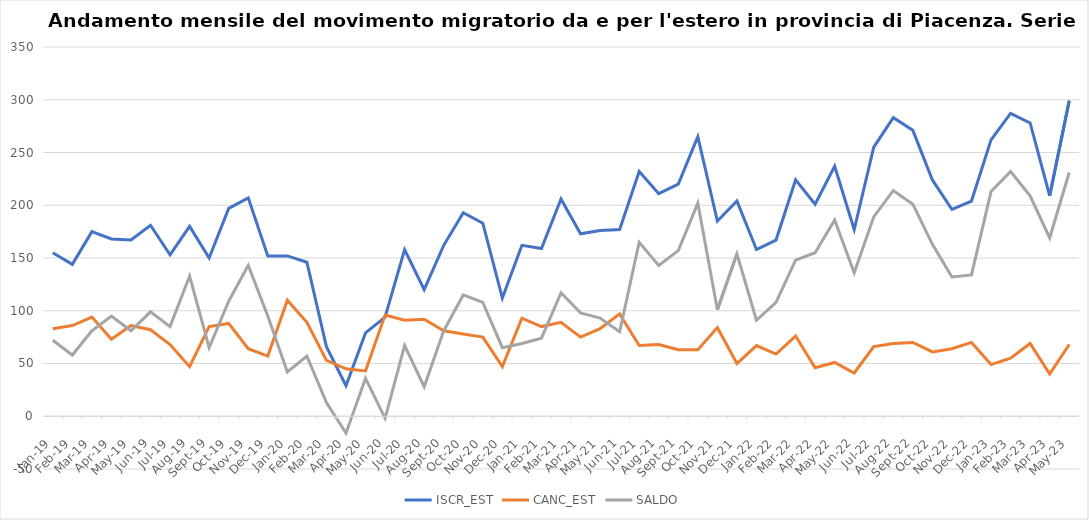
| Category | ISCR_EST | CANC_EST | SALDO |
|---|---|---|---|
| 2019-01-01 | 155 | 83 | 72 |
| 2019-02-01 | 144 | 86 | 58 |
| 2019-03-01 | 175 | 94 | 81 |
| 2019-04-01 | 168 | 73 | 95 |
| 2019-05-01 | 167 | 86 | 81 |
| 2019-06-01 | 181 | 82 | 99 |
| 2019-07-01 | 153 | 68 | 85 |
| 2019-08-01 | 180 | 47 | 133 |
| 2019-09-01 | 150 | 85 | 65 |
| 2019-10-01 | 197 | 88 | 109 |
| 2019-11-01 | 207 | 64 | 143 |
| 2019-12-01 | 152 | 57 | 95 |
| 2020-01-01 | 152 | 110 | 42 |
| 2020-02-01 | 146 | 89 | 57 |
| 2020-03-01 | 66 | 53 | 13 |
| 2020-04-01 | 29 | 45 | -16 |
| 2020-05-01 | 79 | 43 | 36 |
| 2020-06-01 | 94 | 96 | -2 |
| 2020-07-01 | 158 | 91 | 67 |
| 2020-08-01 | 120 | 92 | 28 |
| 2020-09-01 | 162 | 81 | 81 |
| 2020-10-01 | 193 | 78 | 115 |
| 2020-11-01 | 183 | 75 | 108 |
| 2020-12-01 | 112 | 47 | 65 |
| 2021-01-01 | 162 | 93 | 69 |
| 2021-02-01 | 159 | 85 | 74 |
| 2021-03-01 | 206 | 89 | 117 |
| 2021-04-01 | 173 | 75 | 98 |
| 2021-05-01 | 176 | 83 | 93 |
| 2021-06-01 | 177 | 97 | 80 |
| 2021-07-01 | 232 | 67 | 165 |
| 2021-08-01 | 211 | 68 | 143 |
| 2021-09-01 | 220 | 63 | 157 |
| 2021-10-01 | 265 | 63 | 202 |
| 2021-11-01 | 185 | 84 | 101 |
| 2021-12-01 | 204 | 50 | 154 |
| 2022-01-01 | 158 | 67 | 91 |
| 2022-02-01 | 167 | 59 | 108 |
| 2022-03-01 | 224 | 76 | 148 |
| 2022-04-01 | 201 | 46 | 155 |
| 2022-05-01 | 237 | 51 | 186 |
| 2022-06-01 | 177 | 41 | 136 |
| 2022-07-01 | 255 | 66 | 189 |
| 2022-08-01 | 283 | 69 | 214 |
| 2022-09-01 | 271 | 70 | 201 |
| 2022-10-01 | 224 | 61 | 163 |
| 2022-11-01 | 196 | 64 | 132 |
| 2022-12-01 | 204 | 70 | 134 |
| 2023-01-01 | 262 | 49 | 213 |
| 2023-02-01 | 287 | 55 | 232 |
| 2023-03-01 | 278 | 69 | 209 |
| 2023-04-01 | 209 | 40 | 169 |
| 2023-05-01 | 299 | 68 | 231 |